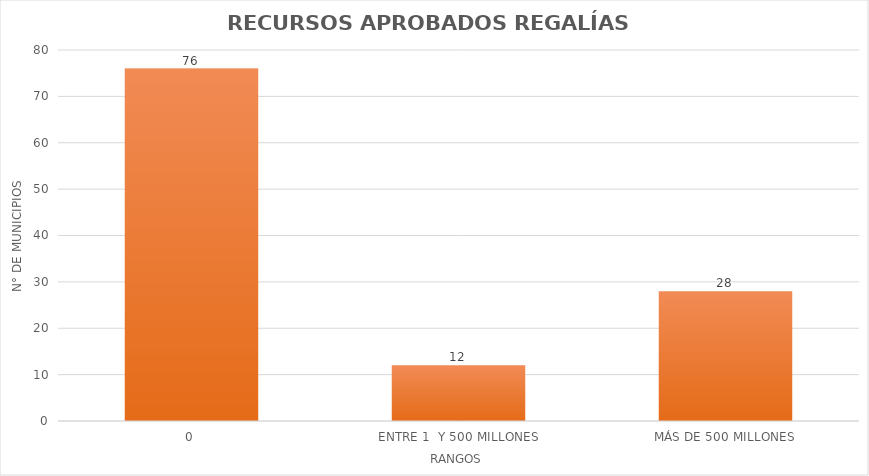
| Category | Series 0 |
|---|---|
| 0 | 76 |
| ENTRE 1  Y 500 MILLONES | 12 |
| MÁS DE 500 MILLONES | 28 |